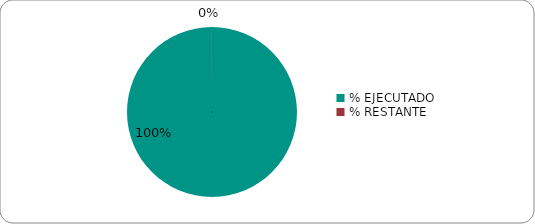
| Category | Series 0 |
|---|---|
| % EJECUTADO | 1 |
| % RESTANTE | 0 |